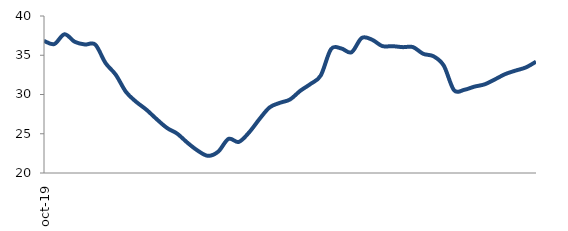
| Category | Series 0 |
|---|---|
| 2019-10-01 | 36.831 |
| 2019-11-01 | 36.425 |
| 2019-12-01 | 37.671 |
| 2020-01-01 | 36.714 |
| 2020-02-01 | 36.369 |
| 2020-03-01 | 36.361 |
| 2020-04-01 | 34.017 |
| 2020-05-01 | 32.52 |
| 2020-06-01 | 30.328 |
| 2020-07-01 | 29.058 |
| 2020-08-01 | 28.052 |
| 2020-09-01 | 26.848 |
| 2020-10-01 | 25.737 |
| 2020-11-01 | 25.008 |
| 2020-12-01 | 23.848 |
| 2021-01-01 | 22.846 |
| 2021-02-01 | 22.188 |
| 2021-03-01 | 22.726 |
| 2021-04-01 | 24.345 |
| 2021-05-01 | 23.958 |
| 2021-06-01 | 25.156 |
| 2021-07-01 | 26.838 |
| 2021-08-01 | 28.346 |
| 2021-09-01 | 28.934 |
| 2021-10-01 | 29.363 |
| 2021-11-01 | 30.47 |
| 2021-12-01 | 31.341 |
| 2022-01-01 | 32.424 |
| 2022-02-01 | 35.771 |
| 2022-03-01 | 35.868 |
| 2022-04-01 | 35.381 |
| 2022-05-01 | 37.2 |
| 2022-06-01 | 36.986 |
| 2022-07-01 | 36.172 |
| 2022-08-01 | 36.157 |
| 2022-09-01 | 36.033 |
| 2022-10-01 | 36.034 |
| 2022-11-01 | 35.183 |
| 2022-12-01 | 34.87 |
| 2023-01-01 | 33.684 |
| 2023-02-01 | 30.55 |
| 2023-03-01 | 30.596 |
| 2023-04-01 | 31.004 |
| 2023-05-01 | 31.3 |
| 2023-06-01 | 31.93 |
| 2023-07-01 | 32.601 |
| 2023-08-01 | 33.043 |
| 2023-09-01 | 33.443 |
| 2023-10-01 | 34.176 |